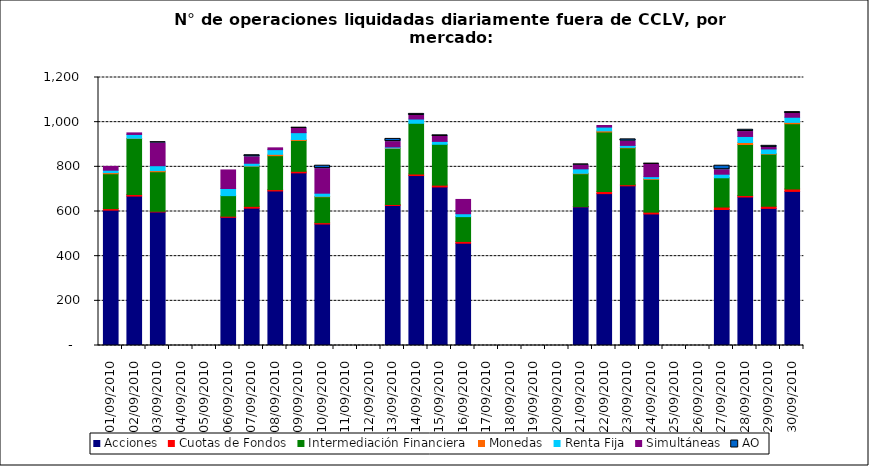
| Category | Acciones | Cuotas de Fondos | Intermediación Financiera | Monedas | Renta Fija | Simultáneas | AO |
|---|---|---|---|---|---|---|---|
| 01/09/2010 | 606 | 7 | 156 | 5 | 11 | 17 | 0 |
| 02/09/2010 | 669 | 7 | 251 | 1 | 17 | 7 | 0 |
| 03/09/2010 | 598 | 3 | 177 | 5 | 22 | 102 | 3 |
| 06/09/2010 | 574 | 5 | 92 | 0 | 32 | 83 | 0 |
| 07/09/2010 | 615 | 8 | 180 | 1 | 12 | 29 | 7 |
| 08/09/2010 | 692 | 6 | 152 | 6 | 21 | 8 | 0 |
| 09/09/2010 | 773 | 7 | 138 | 4 | 31 | 19 | 3 |
| 10/09/2010 | 544 | 6 | 116 | 2 | 14 | 110 | 13 |
| 13/09/2010 | 627 | 4 | 251 | 2 | 5 | 24 | 12 |
| 14/09/2010 | 761 | 7 | 227 | 0 | 19 | 16 | 7 |
| 15/09/2010 | 710 | 8 | 183 | 0 | 13 | 22 | 5 |
| 16/09/2010 | 458 | 8 | 111 | 0 | 13 | 64 | 0 |
| 21/09/2010 | 621 | 1 | 147 | 2 | 20 | 17 | 2 |
| 22/09/2010 | 680 | 9 | 267 | 5 | 17 | 7 | 0 |
| 23/09/2010 | 715 | 5 | 165 | 2 | 9 | 19 | 8 |
| 24/09/2010 | 589 | 8 | 147 | 3 | 9 | 56 | 1 |
| 27/09/2010 | 609 | 11 | 131 | 0 | 16 | 20 | 18 |
| 28/09/2010 | 665 | 7 | 228 | 9 | 27 | 22 | 8 |
| 29/09/2010 | 614 | 9 | 234 | 2 | 21 | 7 | 7 |
| 30/09/2010 | 690 | 11 | 292 | 6 | 23 | 17 | 6 |